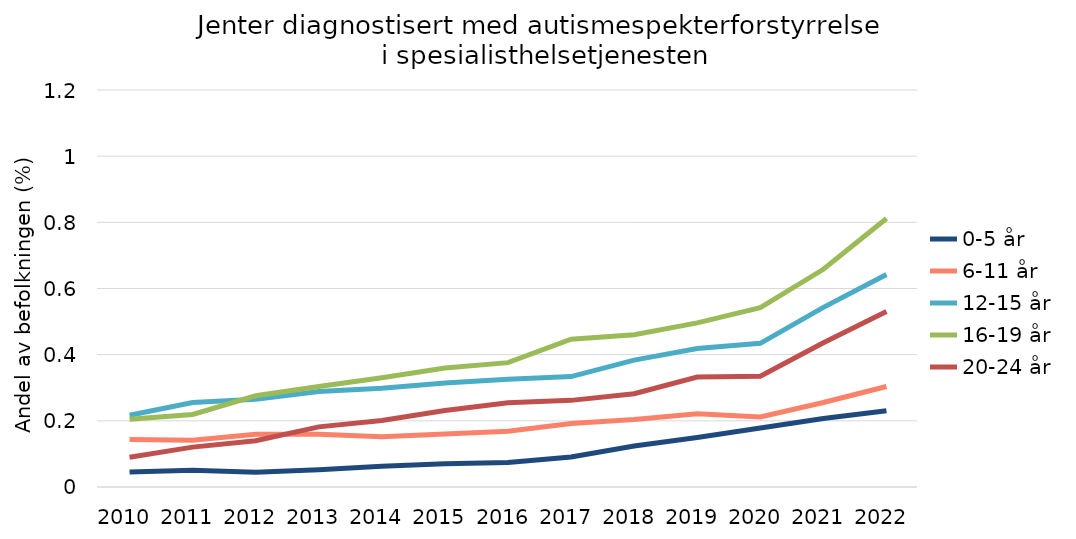
| Category | 0-5 år | 6-11 år | 12-15 år | 16-19 år | 20-24 år |
|---|---|---|---|---|---|
| 2010.0 | 0.046 | 0.143 | 0.217 | 0.205 | 0.09 |
| 2011.0 | 0.051 | 0.142 | 0.255 | 0.219 | 0.121 |
| 2012.0 | 0.045 | 0.16 | 0.265 | 0.276 | 0.14 |
| 2013.0 | 0.052 | 0.16 | 0.289 | 0.304 | 0.182 |
| 2014.0 | 0.063 | 0.152 | 0.298 | 0.33 | 0.201 |
| 2015.0 | 0.07 | 0.16 | 0.314 | 0.359 | 0.231 |
| 2016.0 | 0.074 | 0.169 | 0.326 | 0.376 | 0.255 |
| 2017.0 | 0.091 | 0.192 | 0.334 | 0.447 | 0.262 |
| 2018.0 | 0.124 | 0.204 | 0.384 | 0.46 | 0.282 |
| 2019.0 | 0.15 | 0.222 | 0.419 | 0.496 | 0.332 |
| 2020.0 | 0.178 | 0.212 | 0.434 | 0.542 | 0.335 |
| 2021.0 | 0.207 | 0.255 | 0.543 | 0.658 | 0.436 |
| 2022.0 | 0.231 | 0.304 | 0.642 | 0.812 | 0.531 |